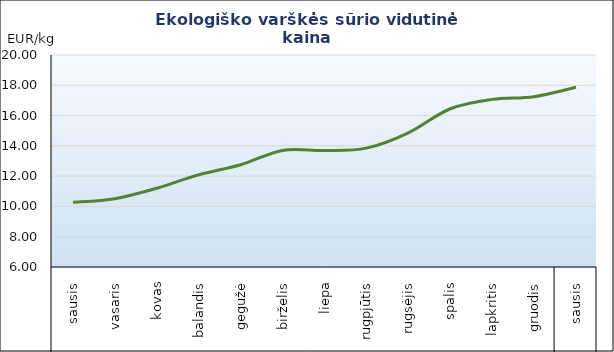
| Category | Varškės sūris |
|---|---|
| 0 | 10.27 |
| 1 | 10.51 |
| 2 | 11.2 |
| 3 | 12.09 |
| 4 | 12.75 |
| 5 | 13.7 |
| 6 | 13.69 |
| 7 | 13.85 |
| 8 | 14.86 |
| 9 | 16.45 |
| 10 | 17.07 |
| 11 | 17.25 |
| 12 | 17.87 |